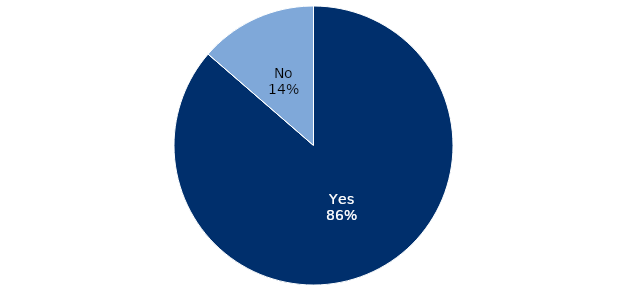
| Category | Occurrences |
|---|---|
| Yes | 38 |
| No | 6 |